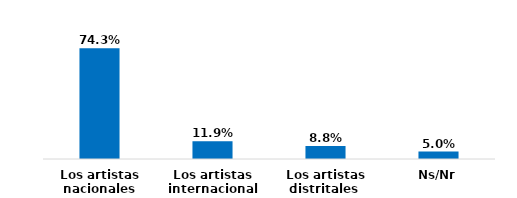
| Category | Series 0 |
|---|---|
| Los artistas nacionales | 0.743 |
| Los artistas internacionales | 0.119 |
| Los artistas distritales  | 0.088 |
| Ns/Nr | 0.05 |